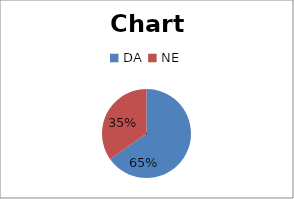
| Category | Series 0 |
|---|---|
| DA  | 30 |
| NE | 16 |